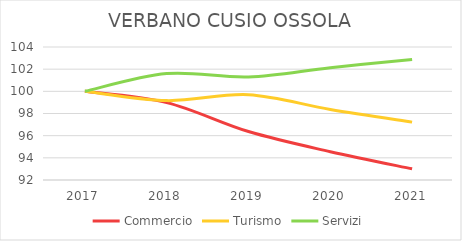
| Category | Commercio | Turismo | Servizi |
|---|---|---|---|
| 2017.0 | 100 | 100 | 100 |
| 2018.0 | 98.984 | 99.163 | 101.603 |
| 2019.0 | 96.371 | 99.696 | 101.301 |
| 2020.0 | 94.556 | 98.364 | 102.138 |
| 2021.0 | 93.008 | 97.222 | 102.881 |